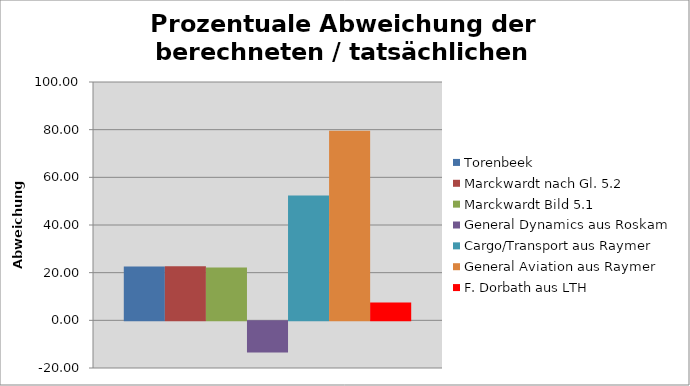
| Category | Torenbeek | Marckwardt nach Gl. 5.2 | Marckwardt Bild 5.1 | General Dynamics aus Roskam | Cargo/Transport aus Raymer | General Aviation aus Raymer | F. Dorbath aus LTH  |
|---|---|---|---|---|---|---|---|
| 0 | 22.625 | 22.667 | 22.156 | -13.123 | 52.407 | 79.591 | 7.492 |